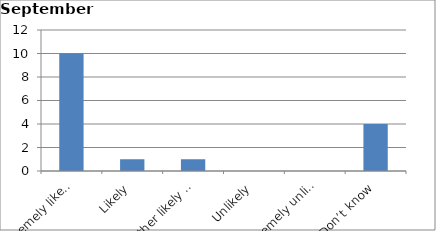
| Category | Series 0 |
|---|---|
| Extremely likely | 10 |
| Likely | 1 |
| Neither likely nor unlikely | 1 |
| Unlikely | 0 |
| Extremely unlikely | 0 |
| Don’t know | 4 |